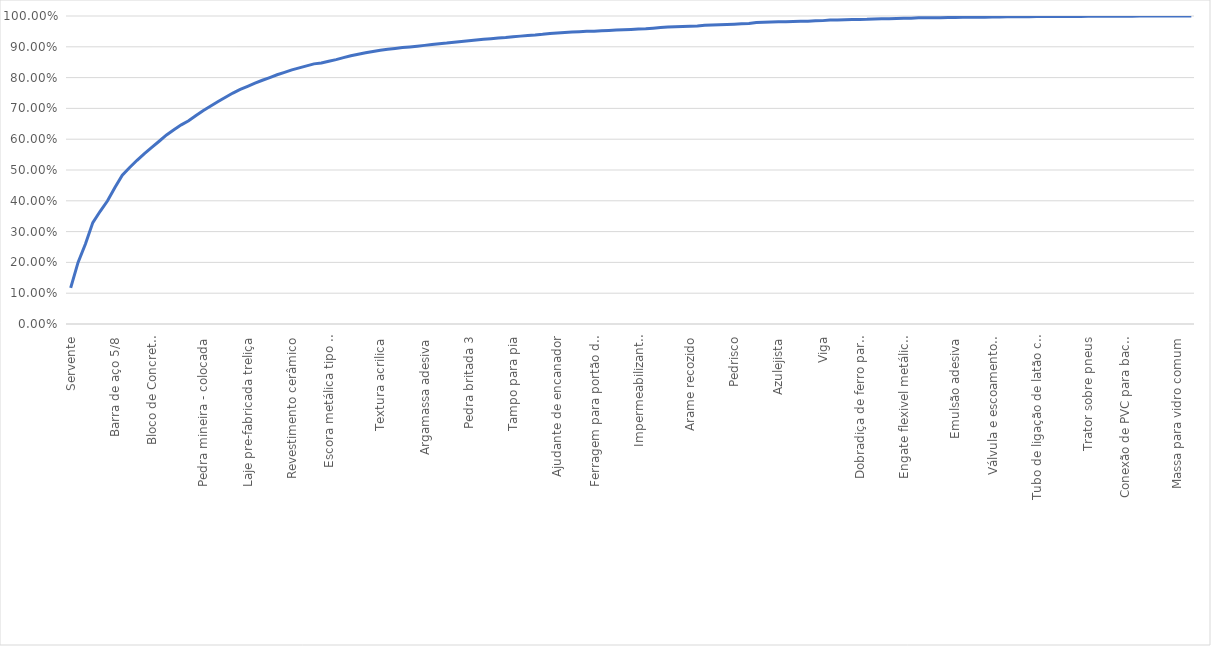
| Category | Series 0 |
|---|---|
| Servente | 0.117 |
| Pedreiro | 0.2 |
| Cimento Portland | 0.26 |
| Porcelanato Polido | 0.329 |
| Areia Lavada | 0.366 |
| Madeira | 0.4 |
| Barra de aço 5/8 | 0.443 |
| Porta Externa duas folhas | 0.483 |
| Carpinteiro | 0.508 |
| Estaca tipo Strauss Moldada | 0.532 |
| Pintor | 0.553 |
| Barra de Aço 50 3/4 | 0.573 |
| Bloco de Concreto Estrutural | 0.593 |
| Ajudante de Pintor | 0.614 |
| Bloco de concreto canaleta | 0.631 |
| Armador | 0.647 |
| Caixilho de Alumínio | 0.66 |
| Concreto dosado em central | 0.677 |
| Pedra mineira - colocada | 0.693 |
| Ajudante de carpinteiro | 0.708 |
| Piso cerâmico esmaltado | 0.723 |
| Tela de aço | 0.736 |
| Bloco de concreto estruturao - inteiro | 0.75 |
| Telha de cerâmica francesa | 0.762 |
| Laje pre-fabricada treliça | 0.772 |
| Emulsao Asfaltica | 0.782 |
| Argamassa pre-fabricada | 0.791 |
| Grama São Carlos | 0.8 |
| Pedra britada 2 | 0.809 |
| Laje pre fabricada (forro) | 0.817 |
| Revestimento cerâmico | 0.825 |
| Cal hidradatada CL III | 0.832 |
| Pontalete 3a construção | 0.838 |
| Tinta latex PVA | 0.845 |
| Ajudante de armador | 0.847 |
| Barra de aço 50 1/4 | 0.853 |
| Escora metálica tipo A (locação) | 0.858 |
| Misturador para lavatorio de mesa | 0.865 |
| Geotextil (não tecido) | 0.871 |
| Barra de aço 50 1/2 | 0.876 |
| Ladrilhista | 0.88 |
| Bloco de concreto Canaleta | 0.885 |
| Textura acrilica | 0.889 |
| Tijolo comum maciço | 0.892 |
| Bacia de louça para caixa | 0.895 |
| Massa corrida | 0.897 |
| Sondagem a percussão | 0.899 |
| Caixa acoplada | 0.902 |
| Argamassa adesiva | 0.905 |
| Chapa compensada resinada | 0.907 |
| Tinta betuminosa | 0.91 |
| Concreto dosado em central Brita | 0.912 |
| Batente de madeira para porta 1 folha | 0.915 |
| Tabua 3a Construção | 0.917 |
| Pedra britada 3 | 0.919 |
| Fechadura completa para porta interna em latão | 0.922 |
| Fechadura completa para porta externa em latão | 0.924 |
| Selador base PVA | 0.926 |
| Ferrage para telhados | 0.928 |
| Sarrafo 3A construção | 0.93 |
| Tampo para pia | 0.933 |
| Selador acrilico | 0.935 |
| Caixilho de aluminio | 0.937 |
| Barra de aço CA 25 3/8 | 0.938 |
| Porta almofadada de madeira 2 faces | 0.94 |
| Caixilho de aluminio padronizado | 0.943 |
| Ajudante de encanador | 0.945 |
| Pedra britada 4 | 0.947 |
| Sifao metálico para lavatório | 0.948 |
| Argamassa pré fabricada de cimento | 0.949 |
| Pedra britada 1 | 0.95 |
| Porta lisa madeira encabeçada | 0.951 |
| Ferragem para portão de tapume | 0.952 |
| Encanador | 0.953 |
| Batende de madeira para porta 2 folhas | 0.954 |
| Prego | 0.955 |
| Chapa compensada plastificada | 0.957 |
| Tabua 3a construção transversal | 0.958 |
| Impermeabilizante estrutural | 0.959 |
| Tampo de granito para lavatório | 0.961 |
| Torneira de pressão para a pia | 0.963 |
| Tinta asfáltica | 0.964 |
| Fecho de alavanca de latão | 0.965 |
| Membrana elástica bicomponente | 0.966 |
| Arame recozido | 0.967 |
| Tabua 3a construção Transversal (1x6) | 0.968 |
| Poste aço para entrada de energia | 0.97 |
| Tudo de aço galvanizado | 0.971 |
| Lixa para superficie de madeira | 0.972 |
| Chuveiro Elétrico | 0.973 |
| Pedrisco | 0.974 |
| Barra de aço 25 1/4 | 0.974 |
| Adubo orgânico curtido | 0.976 |
| Reservátorio de água de fibra de vidro | 0.979 |
| Porta lisa de madeira | 0.98 |
| Jardineiro | 0.98 |
| Azulejista | 0.981 |
| Emulsão adesiva para argamassa | 0.982 |
| Ajudante de eletricista | 0.982 |
| Guarnição de mandeira para porta 1 folha | 0.983 |
| Torneira de pressão para uso geral de parede | 0.983 |
| Chuveiro-Ducha | 0.984 |
| Viga | 0.985 |
| Caixa de chapa de aço para medidor de energia | 0.987 |
| Eletricista | 0.987 |
| Dobradiça de ferro para porta | 0.988 |
| Lavatório de louça | 0.988 |
| Aditivo hidrofungo | 0.989 |
| Dobradiça de ferro para porta - pino leve | 0.989 |
| Tanque de louça para coluna | 0.99 |
| Tabua 3a Construção Transversal 10x120 | 0.991 |
| Adubo mineral | 0.991 |
| Chapa compensada resinada | 0.992 |
| Bacia de louça turca | 0.993 |
| Engate flexivel metálico para entrada de água | 0.993 |
| Hidrometro multijato para medição de água residencial | 0.994 |
| Assento plástico para bacia | 0.994 |
| Lavatório de louça para coluna padrão | 0.994 |
| Taco de madeira para instalação de portas e janelas | 0.995 |
| Cimento branco não estrutural | 0.995 |
| Emulsão adesiva | 0.995 |
| Sifão metálico para tanque cromado | 0.996 |
| Coluna de louça para lavatório padrão | 0.996 |
| Betoneira elétrica | 0.996 |
| Tubo cerâmico para esgoto | 0.996 |
| Guanição de madeira para porta 2 folhas | 0.997 |
| Válvula e escoamento metálica para lavatório | 0.997 |
| Porta lisa madeira (espessura: 35mm) | 0.997 |
| Telha de fibrocimento ondulada | 0.998 |
| Fio isolado em PVC  | 0.998 |
| Ajudante | 0.998 |
| Coluna de louça para tanque | 0.998 |
| Tubo de ligação de latão com canopla para chuveiro | 0.998 |
| Parafuso madeira cabeça chata fenda simples | 0.998 |
| Arame galvanizado | 0.998 |
| Prafuso cromado | 0.998 |
| Prego | 0.998 |
| Cumeeira para telha de Fibroc Articulada Inferior | 0.998 |
| Trator sobre pneus | 0.999 |
| Conjunto de fixação para tanque | 0.999 |
| Engate flexível de PVC para entrada de água | 0.999 |
| Prego 15x15 | 0.999 |
| Clacário dolomítico | 0.999 |
| Engate flexível de PVC para entrada de água (D=1) | 1 |
| Conexão de PVC para bacia com saida horizontal | 1 |
| Válvula de escoamento metálica para tanque | 1 |
| Prego 19x33 | 1 |
| Fosfato de Rochas | 1 |
| Bucha de Nylon | 1 |
| Fita de vedação para tubos e conexões roscáveis | 1 |
| Massa para vidro comum | 1 |
| Adesivo para tubo de PVC | 1 |
| Grade de disco recbocável | 1 |